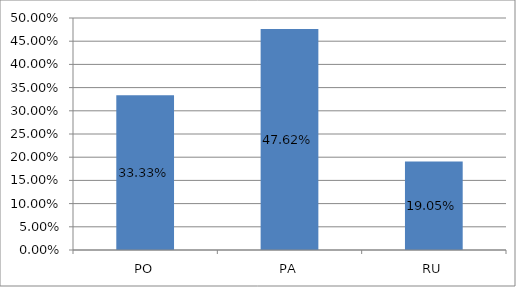
| Category | Series 0 |
|---|---|
| PO | 0.333 |
| PA | 0.476 |
| RU | 0.19 |